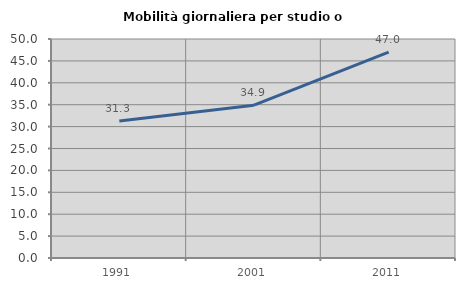
| Category | Mobilità giornaliera per studio o lavoro |
|---|---|
| 1991.0 | 31.267 |
| 2001.0 | 34.892 |
| 2011.0 | 46.983 |